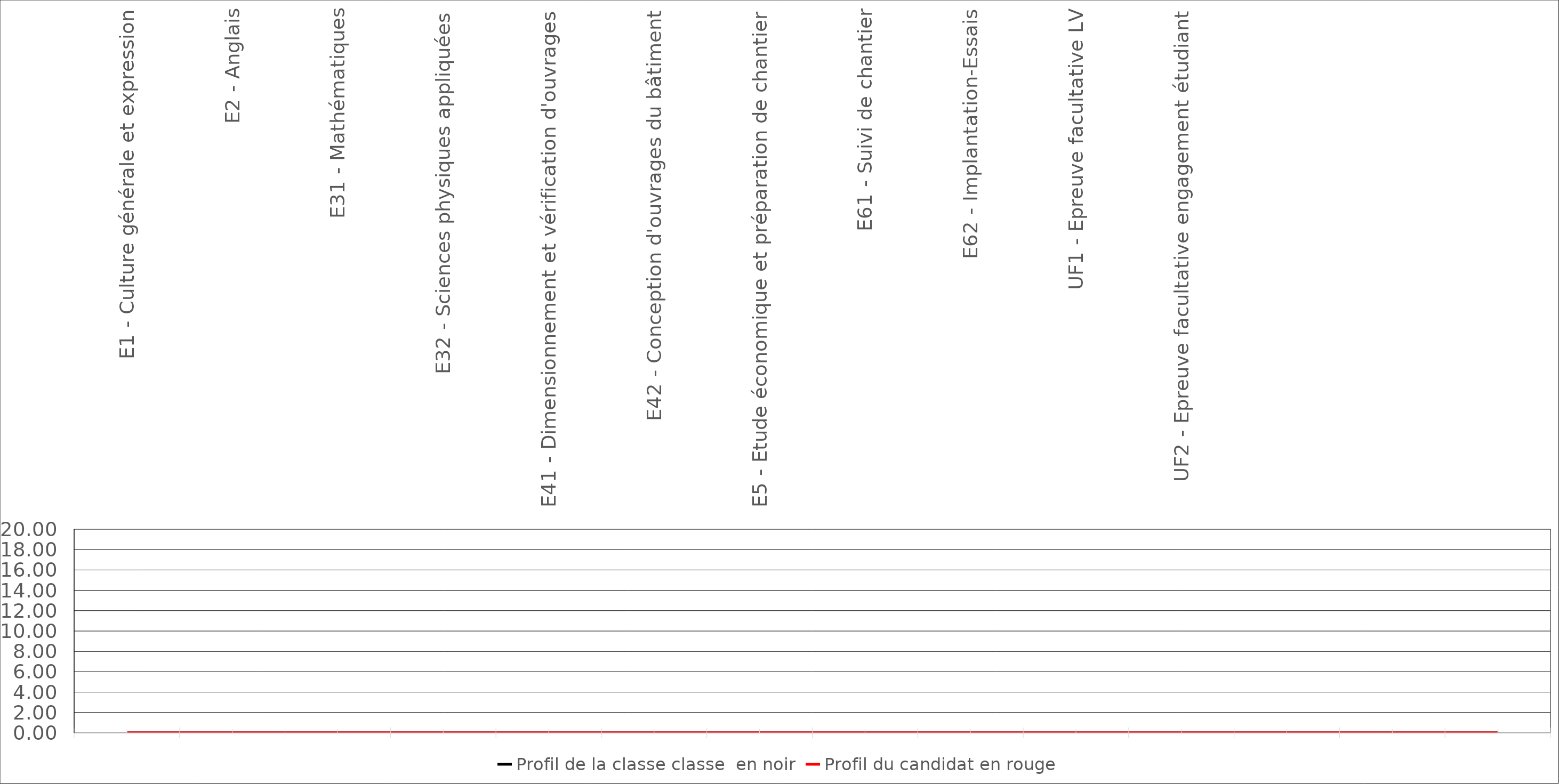
| Category | Profil de la classe classe  en noir | Profil du candidat en rouge |
|---|---|---|
| E1 - Culture générale et expression | 0 | 0 |
| E2 - Anglais | 0 | 0 |
| E31 - Mathématiques | 0 | 0 |
| E32 - Sciences physiques appliquées | 0 | 0 |
| E41 - Dimensionnement et vérification d'ouvrages | 0 | 0 |
| E42 - Conception d'ouvrages du bâtiment | 0 | 0 |
| E5 - Etude économique et préparation de chantier | 0 | 0 |
| E61 - Suivi de chantier | 0 | 0 |
| E62 - Implantation-Essais | 0 | 0 |
| UF1 - Epreuve facultative LV | 0 | 0 |
| UF2 - Epreuve facultative engagement étudiant | 0 | 0 |